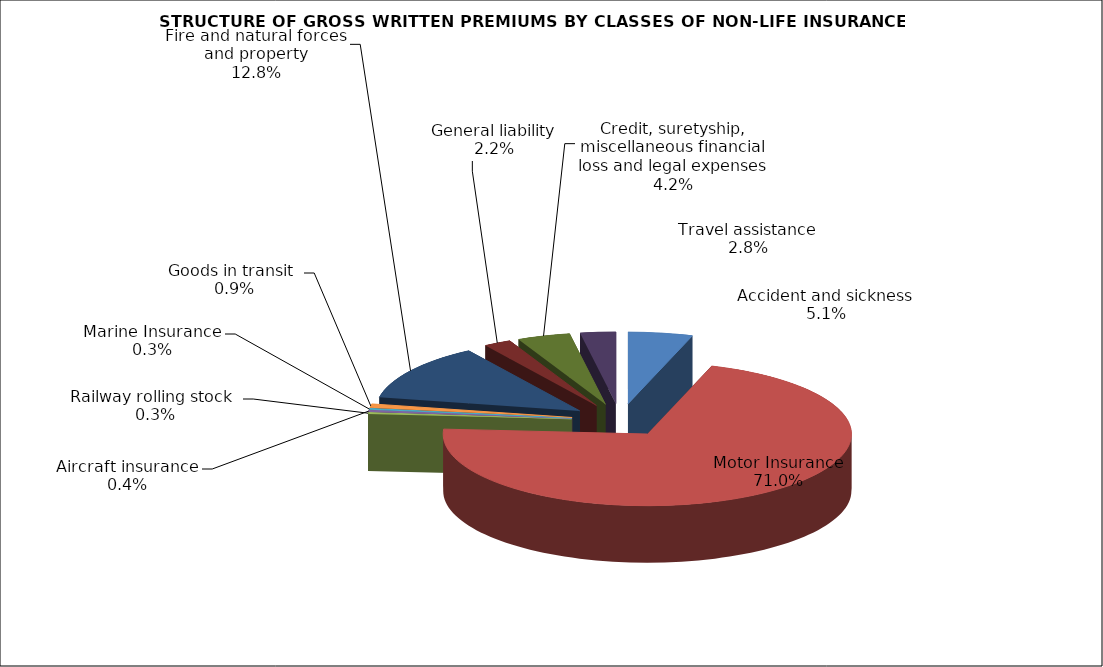
| Category | Accident and sickness |
|---|---|
| Accident and sickness | 0.051 |
| Motor Insurance | 0.71 |
| Railway rolling stock  | 0.003 |
| Aircraft insurance | 0.004 |
| Marine Insurance | 0.003 |
| Goods in transit  | 0.009 |
| Fire and natural forces and property | 0.128 |
| General liability | 0.022 |
| Credit, suretyship, miscellaneous financial loss and legal expenses | 0.042 |
| Travel assistance | 0.028 |